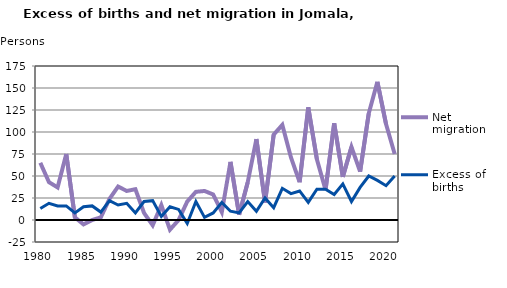
| Category | Net migration | Excess of births |
|---|---|---|
| 1980.0 | 65 | 13 |
| 1981.0 | 43 | 19 |
| 1982.0 | 37 | 16 |
| 1983.0 | 75 | 16 |
| 1984.0 | 3 | 8 |
| 1985.0 | -5 | 15 |
| 1986.0 | 0 | 16 |
| 1987.0 | 3 | 9 |
| 1988.0 | 24 | 22 |
| 1989.0 | 38 | 17 |
| 1990.0 | 33 | 19 |
| 1991.0 | 35 | 8 |
| 1992.0 | 8 | 21 |
| 1993.0 | -6 | 22 |
| 1994.0 | 17 | 4 |
| 1995.0 | -11 | 15 |
| 1996.0 | 0 | 12 |
| 1997.0 | 21 | -4 |
| 1998.0 | 32 | 21 |
| 1999.0 | 33 | 3 |
| 2000.0 | 29 | 8 |
| 2001.0 | 9 | 20 |
| 2002.0 | 66 | 10 |
| 2003.0 | 6 | 8 |
| 2004.0 | 43 | 21 |
| 2005.0 | 92 | 10 |
| 2006.0 | 20 | 25 |
| 2007.0 | 97 | 14 |
| 2008.0 | 108 | 36 |
| 2009.0 | 71 | 30 |
| 2010.0 | 43 | 33 |
| 2011.0 | 128 | 20 |
| 2012.0 | 69 | 35 |
| 2013.0 | 34 | 35 |
| 2014.0 | 110 | 29 |
| 2015.0 | 49 | 41 |
| 2016.0 | 83 | 21 |
| 2017.0 | 55 | 37 |
| 2018.0 | 121 | 50 |
| 2019.0 | 157 | 45 |
| 2020.0 | 109 | 39 |
| 2021.0 | 75 | 50 |